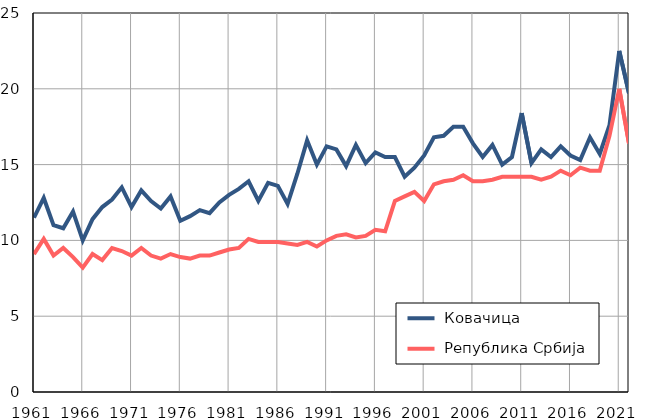
| Category |  Ковачица |  Република Србија |
|---|---|---|
| 1961.0 | 11.5 | 9.1 |
| 1962.0 | 12.8 | 10.1 |
| 1963.0 | 11 | 9 |
| 1964.0 | 10.8 | 9.5 |
| 1965.0 | 11.9 | 8.9 |
| 1966.0 | 10 | 8.2 |
| 1967.0 | 11.4 | 9.1 |
| 1968.0 | 12.2 | 8.7 |
| 1969.0 | 12.7 | 9.5 |
| 1970.0 | 13.5 | 9.3 |
| 1971.0 | 12.2 | 9 |
| 1972.0 | 13.3 | 9.5 |
| 1973.0 | 12.6 | 9 |
| 1974.0 | 12.1 | 8.8 |
| 1975.0 | 12.9 | 9.1 |
| 1976.0 | 11.3 | 8.9 |
| 1977.0 | 11.6 | 8.8 |
| 1978.0 | 12 | 9 |
| 1979.0 | 11.8 | 9 |
| 1980.0 | 12.5 | 9.2 |
| 1981.0 | 13 | 9.4 |
| 1982.0 | 13.4 | 9.5 |
| 1983.0 | 13.9 | 10.1 |
| 1984.0 | 12.6 | 9.9 |
| 1985.0 | 13.8 | 9.9 |
| 1986.0 | 13.6 | 9.9 |
| 1987.0 | 12.4 | 9.8 |
| 1988.0 | 14.4 | 9.7 |
| 1989.0 | 16.6 | 9.9 |
| 1990.0 | 15 | 9.6 |
| 1991.0 | 16.2 | 10 |
| 1992.0 | 16 | 10.3 |
| 1993.0 | 14.9 | 10.4 |
| 1994.0 | 16.3 | 10.2 |
| 1995.0 | 15.1 | 10.3 |
| 1996.0 | 15.8 | 10.7 |
| 1997.0 | 15.5 | 10.6 |
| 1998.0 | 15.5 | 12.6 |
| 1999.0 | 14.2 | 12.9 |
| 2000.0 | 14.8 | 13.2 |
| 2001.0 | 15.6 | 12.6 |
| 2002.0 | 16.8 | 13.7 |
| 2003.0 | 16.9 | 13.9 |
| 2004.0 | 17.5 | 14 |
| 2005.0 | 17.5 | 14.3 |
| 2006.0 | 16.4 | 13.9 |
| 2007.0 | 15.5 | 13.9 |
| 2008.0 | 16.3 | 14 |
| 2009.0 | 15 | 14.2 |
| 2010.0 | 15.5 | 14.2 |
| 2011.0 | 18.4 | 14.2 |
| 2012.0 | 15.1 | 14.2 |
| 2013.0 | 16 | 14 |
| 2014.0 | 15.5 | 14.2 |
| 2015.0 | 16.2 | 14.6 |
| 2016.0 | 15.6 | 14.3 |
| 2017.0 | 15.3 | 14.8 |
| 2018.0 | 16.8 | 14.6 |
| 2019.0 | 15.7 | 14.6 |
| 2020.0 | 17.6 | 16.9 |
| 2021.0 | 22.5 | 20 |
| 2022.0 | 19.7 | 16.4 |